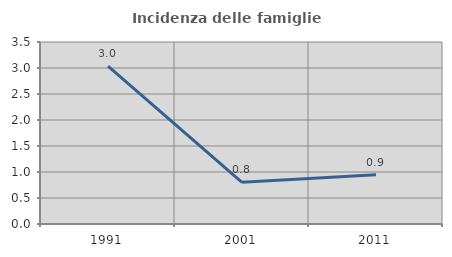
| Category | Incidenza delle famiglie numerose |
|---|---|
| 1991.0 | 3.037 |
| 2001.0 | 0.802 |
| 2011.0 | 0.947 |